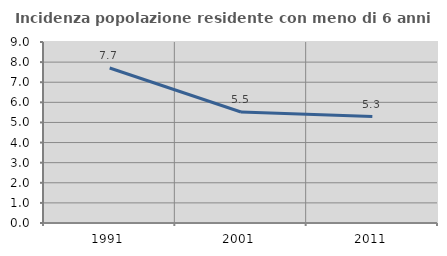
| Category | Incidenza popolazione residente con meno di 6 anni |
|---|---|
| 1991.0 | 7.707 |
| 2001.0 | 5.519 |
| 2011.0 | 5.295 |